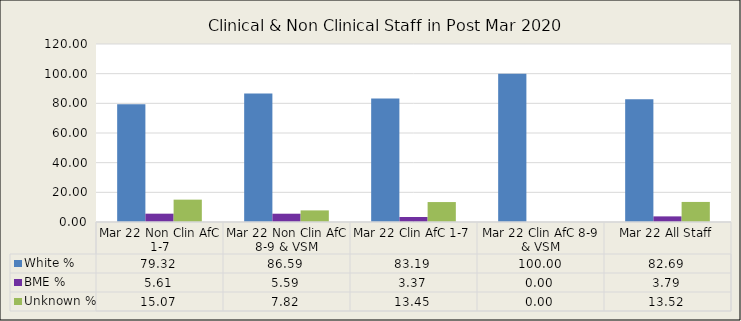
| Category | White % | BME % | Unknown % |
|---|---|---|---|
| Mar 22 Non Clin AfC 1-7 | 79.318 | 5.611 | 15.072 |
| Mar 22 Non Clin AfC 8-9 & VSM | 86.592 | 5.587 | 7.821 |
| Mar 22 Clin AfC 1-7 | 83.188 | 3.367 | 13.446 |
| Mar 22 Clin AfC 8-9 & VSM | 100 | 0 | 0 |
| Mar 22 All Staff | 82.688 | 3.788 | 13.525 |